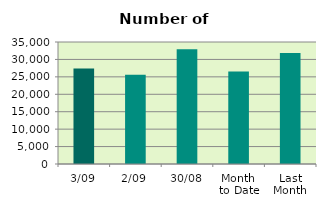
| Category | Series 0 |
|---|---|
| 3/09 | 27418 |
| 2/09 | 25590 |
| 30/08 | 32952 |
| Month 
to Date | 26504 |
| Last
Month | 31813.182 |